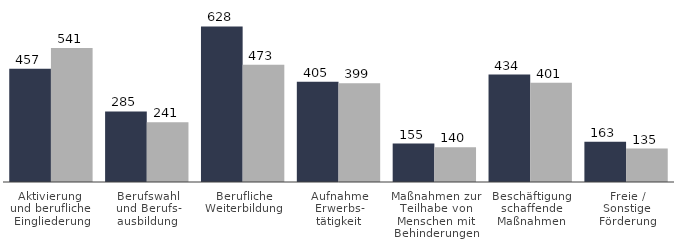
| Category |   August 2018
  (vorläufig und
  hochgerechnet) |   August 2017 |
|---|---|---|
| Aktivierung 
und berufliche 
Eingliederung | 457 | 541 |
| Berufswahl
und Berufs-
ausbildung | 285 | 241 |
| Berufliche
Weiterbildung | 628 | 473 |
| Aufnahme
Erwerbs-
tätigkeit | 405 | 399 |
| Maßnahmen zur
Teilhabe von
Menschen mit
Behinderungen | 155 | 140 |
| Beschäftigung
schaffende
Maßnahmen | 434 | 401 |
| Freie /
Sonstige
Förderung | 163 | 135 |